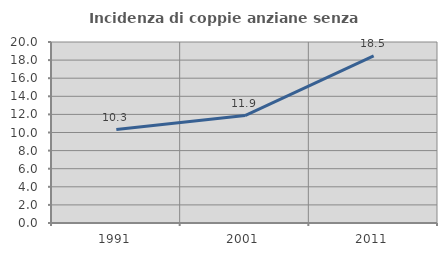
| Category | Incidenza di coppie anziane senza figli  |
|---|---|
| 1991.0 | 10.323 |
| 2001.0 | 11.875 |
| 2011.0 | 18.471 |